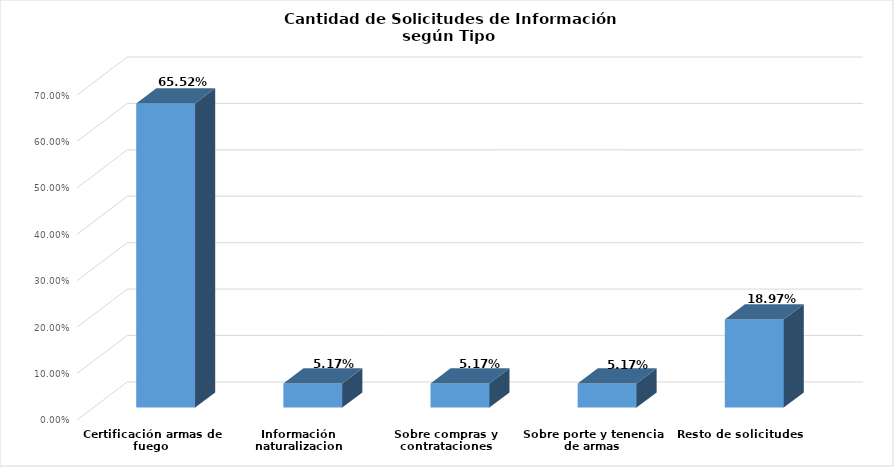
| Category | Series 0 |
|---|---|
| Certificación armas de fuego | 0.655 |
| Información naturalizacion | 0.052 |
| Sobre compras y contrataciones | 0.052 |
| Sobre porte y tenencia de armas | 0.052 |
| Resto de solicitudes | 0.19 |